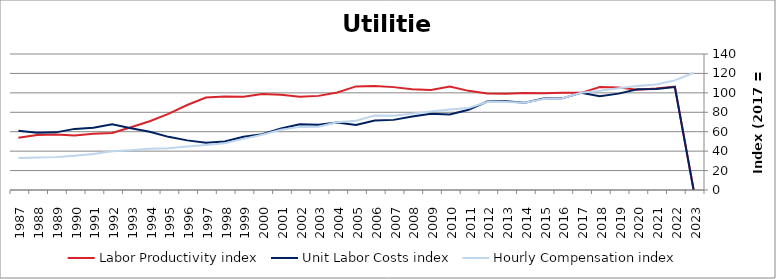
| Category | Labor Productivity index | Unit Labor Costs index | Hourly Compensation index |
|---|---|---|---|
| 2023.0 | 0 | 0 | 120.661 |
| 2022.0 | 106.515 | 105.942 | 112.844 |
| 2021.0 | 104.53 | 103.929 | 108.637 |
| 2020.0 | 103.327 | 103.653 | 107.101 |
| 2019.0 | 105.504 | 99.209 | 104.669 |
| 2018.0 | 105.922 | 96.495 | 102.21 |
| 2017.0 | 100 | 100 | 100 |
| 2016.0 | 100.022 | 94.343 | 94.364 |
| 2015.0 | 99.534 | 94.14 | 93.701 |
| 2014.0 | 99.815 | 89.904 | 89.738 |
| 2013.0 | 99.138 | 91.364 | 90.577 |
| 2012.0 | 99.297 | 91.133 | 90.492 |
| 2011.0 | 102.063 | 82.687 | 84.392 |
| 2010.0 | 106.509 | 77.842 | 82.909 |
| 2009.0 | 102.954 | 78.55 | 80.871 |
| 2008.0 | 103.833 | 75.713 | 78.616 |
| 2007.0 | 105.899 | 72.185 | 76.443 |
| 2006.0 | 107.032 | 71.578 | 76.611 |
| 2005.0 | 106.638 | 66.816 | 71.251 |
| 2004.0 | 100.391 | 69.356 | 69.627 |
| 2003.0 | 96.894 | 67.246 | 65.158 |
| 2002.0 | 95.966 | 67.708 | 64.976 |
| 2001.0 | 98.083 | 63.257 | 62.044 |
| 2000.0 | 98.862 | 57.509 | 56.855 |
| 1999.0 | 95.941 | 54.838 | 52.612 |
| 1998.0 | 96.178 | 50.021 | 48.109 |
| 1997.0 | 95.16 | 48.766 | 46.405 |
| 1996.0 | 87.521 | 51.08 | 44.706 |
| 1995.0 | 78.427 | 54.712 | 42.909 |
| 1994.0 | 70.765 | 59.941 | 42.417 |
| 1993.0 | 64.589 | 63.519 | 41.026 |
| 1992.0 | 58.78 | 67.677 | 39.781 |
| 1991.0 | 57.825 | 64.069 | 37.048 |
| 1990.0 | 56.049 | 62.92 | 35.266 |
| 1989.0 | 57.043 | 59.325 | 33.841 |
| 1988.0 | 56.592 | 58.964 | 33.369 |
| 1987.0 | 53.799 | 61.053 | 32.846 |